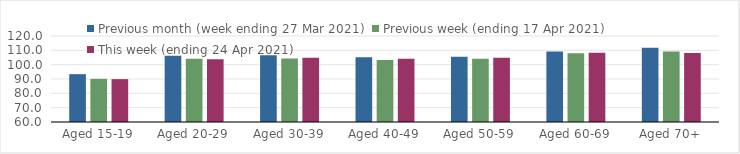
| Category | Previous month (week ending 27 Mar 2021) | Previous week (ending 17 Apr 2021) | This week (ending 24 Apr 2021) |
|---|---|---|---|
| Aged 15-19 | 93.37 | 90.1 | 89.9 |
| Aged 20-29 | 106.29 | 104.05 | 103.85 |
| Aged 30-39 | 106.6 | 104.3 | 104.83 |
| Aged 40-49 | 105.24 | 103.23 | 104.15 |
| Aged 50-59 | 105.51 | 104.07 | 104.86 |
| Aged 60-69 | 109.16 | 107.91 | 108.24 |
| Aged 70+ | 111.86 | 109.19 | 108.1 |